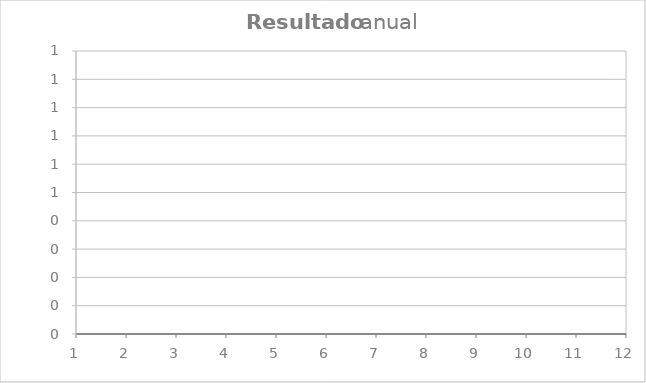
| Category | ingresos |
|---|---|
| 0 | 0 |
| 1 | 0 |
| 2 | 0 |
| 3 | 0 |
| 4 | 0 |
| 5 | 0 |
| 6 | 0 |
| 7 | 0 |
| 8 | 0 |
| 9 | 0 |
| 10 | 0 |
| 11 | 0 |